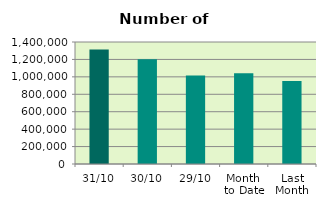
| Category | Series 0 |
|---|---|
| 31/10 | 1314278 |
| 30/10 | 1202658 |
| 29/10 | 1016994 |
| Month 
to Date | 1042648 |
| Last
Month | 952931.048 |